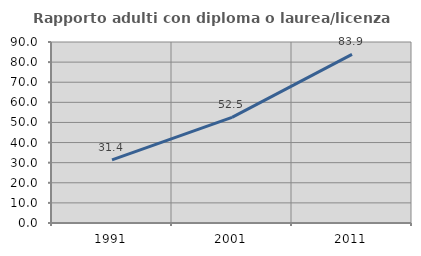
| Category | Rapporto adulti con diploma o laurea/licenza media  |
|---|---|
| 1991.0 | 31.373 |
| 2001.0 | 52.5 |
| 2011.0 | 83.871 |